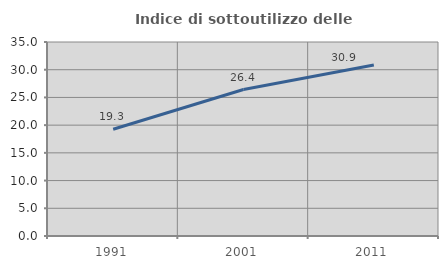
| Category | Indice di sottoutilizzo delle abitazioni  |
|---|---|
| 1991.0 | 19.268 |
| 2001.0 | 26.42 |
| 2011.0 | 30.856 |